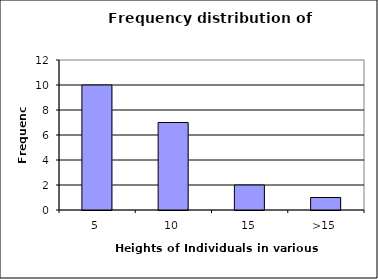
| Category | Series 0 |
|---|---|
| 5 | 10 |
| 10 | 7 |
| 15 | 2 |
| >15 | 1 |